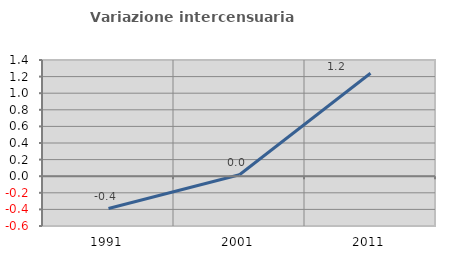
| Category | Variazione intercensuaria annua |
|---|---|
| 1991.0 | -0.389 |
| 2001.0 | 0.018 |
| 2011.0 | 1.24 |